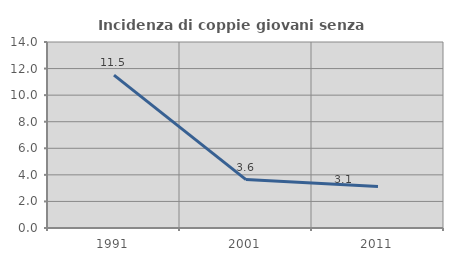
| Category | Incidenza di coppie giovani senza figli |
|---|---|
| 1991.0 | 11.504 |
| 2001.0 | 3.644 |
| 2011.0 | 3.125 |